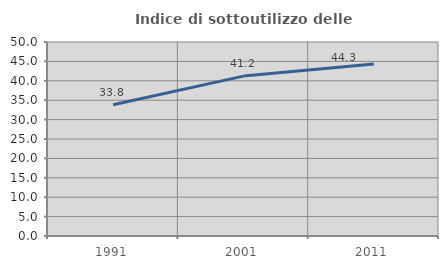
| Category | Indice di sottoutilizzo delle abitazioni  |
|---|---|
| 1991.0 | 33.818 |
| 2001.0 | 41.207 |
| 2011.0 | 44.315 |